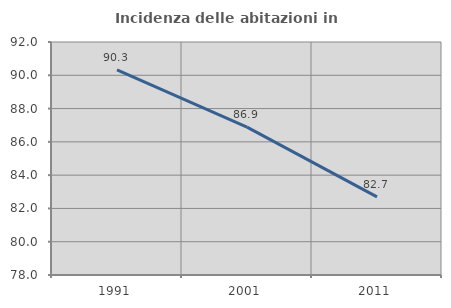
| Category | Incidenza delle abitazioni in proprietà  |
|---|---|
| 1991.0 | 90.323 |
| 2001.0 | 86.885 |
| 2011.0 | 82.692 |